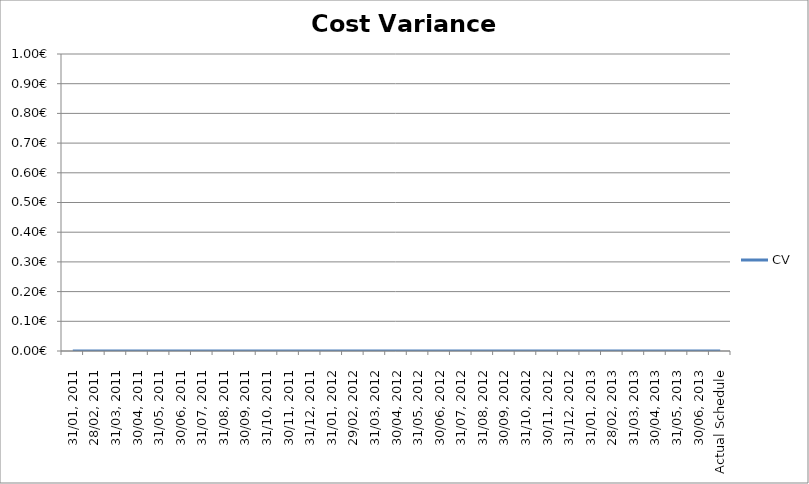
| Category | CV |
|---|---|
| 31/01, 2011 | 0 |
| 28/02, 2011 | 0 |
| 31/03, 2011 | 0 |
| 30/04, 2011 | 0 |
| 31/05, 2011 | 0 |
| 30/06, 2011 | 0 |
| 31/07, 2011 | 0 |
| 31/08, 2011 | 0 |
| 30/09, 2011 | 0 |
| 31/10, 2011 | 0 |
| 30/11, 2011 | 0 |
| 31/12, 2011 | 0 |
| 31/01, 2012 | 0 |
| 29/02, 2012 | 0 |
| 31/03, 2012 | 0 |
| 30/04, 2012 | 0 |
| 31/05, 2012 | 0 |
| 30/06, 2012 | 0 |
| 31/07, 2012 | 0 |
| 31/08, 2012 | 0 |
| 30/09, 2012 | 0 |
| 31/10, 2012 | 0 |
| 30/11, 2012 | 0 |
| 31/12, 2012 | 0 |
| 31/01, 2013 | 0 |
| 28/02, 2013 | 0 |
| 31/03, 2013 | 0 |
| 30/04, 2013 | 0 |
| 31/05, 2013 | 0 |
| 30/06, 2013 | 0 |
| Actual Schedule | 0 |